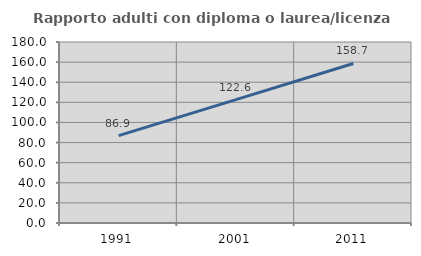
| Category | Rapporto adulti con diploma o laurea/licenza media  |
|---|---|
| 1991.0 | 86.882 |
| 2001.0 | 122.648 |
| 2011.0 | 158.651 |